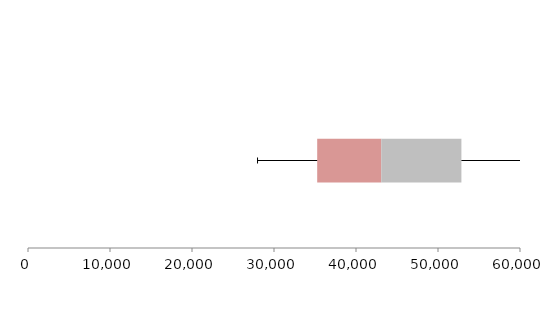
| Category | Series 1 | Series 2 | Series 3 |
|---|---|---|---|
| 0 | 35267.867 | 7813.606 | 9773.095 |